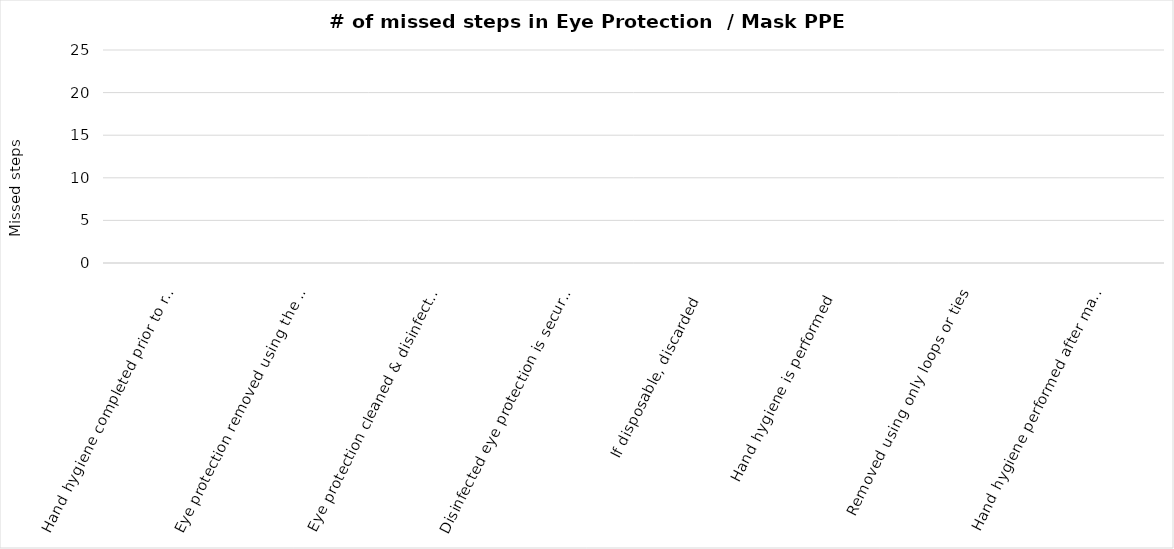
| Category | Series 0 |
|---|---|
| Hand hygiene completed prior to removal of eye protection | 0 |
| Eye protection removed using the arms or straps | 0 |
| Eye protection cleaned & disinfected with FAD | 0 |
| Disinfected eye protection is securely stored | 0 |
| If disposable, discarded | 0 |
| Hand hygiene is performed | 0 |
| Removed using only loops or ties | 0 |
| Hand hygiene performed after mask/N95 respirator removed, disinfected, stored, or discarded | 0 |